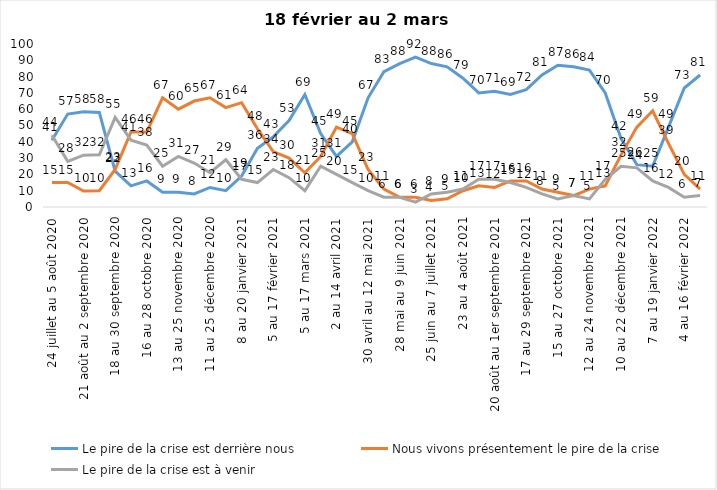
| Category | Le pire de la crise est derrière nous | Nous vivons présentement le pire de la crise | Le pire de la crise est à venir |
|---|---|---|---|
| 24 juillet au 5 août 2020 | 41 | 15 | 44 |
| 7 au 19 août 2020 | 57 | 15 | 28 |
| 21 août au 2 septembre 2020 | 58.39 | 9.84 | 31.77 |
| 4 au 16 septembre 2020 | 58 | 10 | 32 |
| 18 au 30 septembre 2020 | 22 | 23 | 55 |
| 2 au 14 octobre 2020 | 13 | 46 | 41 |
| 16 au 28 octobre 2020 | 16 | 46 | 38 |
| 30 octobre au 11 novembre 2020 | 9 | 67 | 25 |
| 13 au 25 novembre 2020 | 9 | 60 | 31 |
| 27 novembre au 9 décembre 2020 | 8 | 65 | 27 |
| 11 au 25 décembre 2020 | 12 | 67 | 21 |
| 25 décembre 2020 au 6 janvier 2021 | 10 | 61 | 29 |
| 8 au 20 janvier 2021 | 19 | 64 | 17 |
| 22 janvier au 3 février 2021 | 36 | 48 | 15 |
| 5 au 17 février 2021 | 43 | 34 | 23 |
| 19 février au 3 mars 2021 | 53 | 30 | 18 |
| 5 au 17 mars 2021 | 69 | 21 | 10 |
| 19 au 31 mars 2021 | 45 | 31 | 25 |
| 2 au 14 avril 2021 | 31 | 49 | 20 |
| 16 au 28 avril 2021 | 40 | 45 | 15 |
| 30 avril au 12 mai 2021 | 67 | 23 | 10 |
| 14 au 26 mai 2021 | 83 | 11 | 6 |
| 28 mai au 9 juin 2021 | 88 | 6 | 6 |
| 11 au 23 juin 2021 | 92 | 6 | 3 |
| 25 juin au 7 juillet 2021 | 88 | 4 | 8 |
| 9 au 21 juillet 2021 | 86 | 5 | 9 |
| 23 au 4 août 2021 | 79 | 10 | 11 |
| 6 au 18 août 2021 | 70 | 13 | 17 |
| 20 août au 1er septembre 2021 | 71 | 12 | 17 |
| 3 au 15 septembre 2021 | 69 | 16 | 15 |
| 17 au 29 septembre 2021 | 72 | 16 | 12 |
| 1 au 13 octobre 2021 | 81 | 11 | 8 |
| 15 au 27 octobre 2021 | 87 | 9 | 5 |
| 29 octobre au 10 novembre 2021 | 86 | 7 | 7 |
| 12 au 24 novembre 2021 | 84 | 11 | 5 |
| 26 novembre au 8 décembre 2021 | 70 | 13 | 17 |
| 10 au 22 décembre 2021 | 42 | 32 | 25 |
| 24 décembre 2021 au 5 janvier 2022 | 26 | 49 | 24 |
| 7 au 19 janvier 2022 | 25 | 59 | 16 |
| 21 janvier au 2 février 2022 | 49 | 39 | 12 |
| 4 au 16 février 2022 | 73 | 20 | 6 |
| 18 février au 2 mars  2022 | 81 | 11 | 7 |